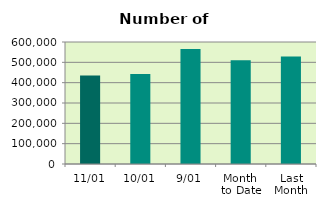
| Category | Series 0 |
|---|---|
| 11/01 | 435054 |
| 10/01 | 443182 |
| 9/01 | 565500 |
| Month 
to Date | 510155.75 |
| Last
Month | 528134.632 |